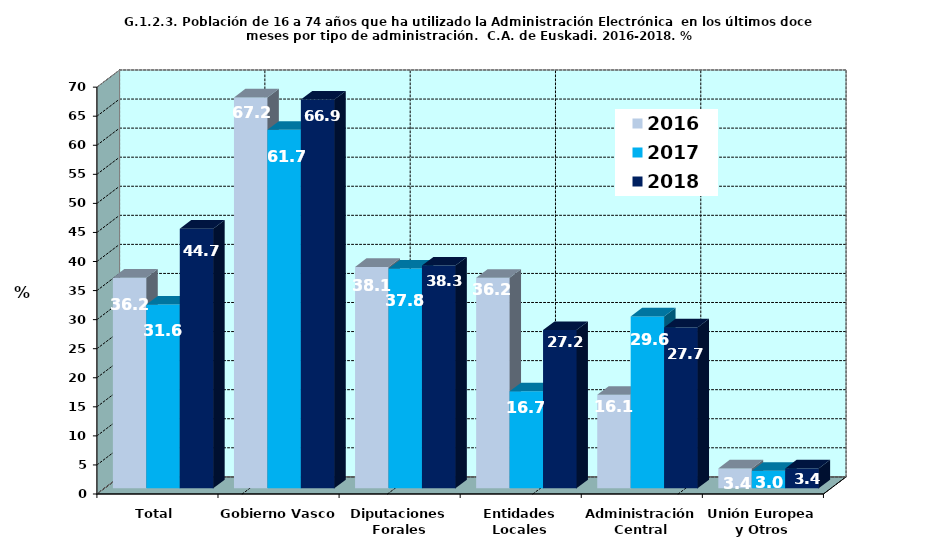
| Category | 2016 | 2017 | 2018 |
|---|---|---|---|
| Total | 36.231 | 31.608 | 44.663 |
| Gobierno Vasco | 67.249 | 61.687 | 66.88 |
| Diputaciones Forales | 38.099 | 37.801 | 38.329 |
| Entidades Locales | 36.213 | 16.693 | 27.228 |
| Administración Central | 16.081 | 29.562 | 27.688 |
| Unión Europea y Otros | 3.41 | 3.015 | 3.426 |